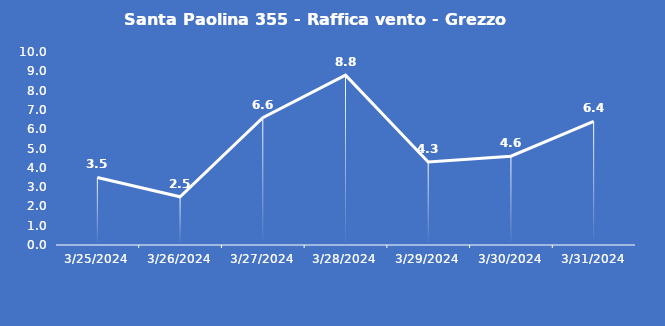
| Category | Santa Paolina 355 - Raffica vento - Grezzo (m/s) |
|---|---|
| 3/25/24 | 3.5 |
| 3/26/24 | 2.5 |
| 3/27/24 | 6.6 |
| 3/28/24 | 8.8 |
| 3/29/24 | 4.3 |
| 3/30/24 | 4.6 |
| 3/31/24 | 6.4 |